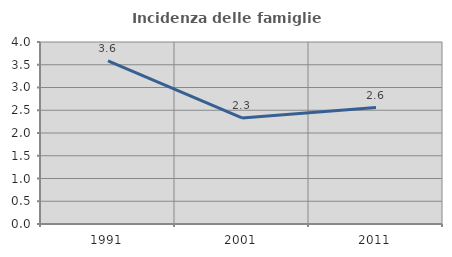
| Category | Incidenza delle famiglie numerose |
|---|---|
| 1991.0 | 3.586 |
| 2001.0 | 2.33 |
| 2011.0 | 2.558 |